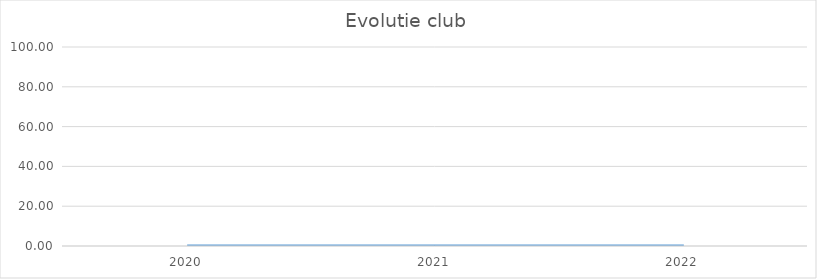
| Category | 0,00 |
|---|---|
| 2020.0 | 0 |
| 2021.0 | 0 |
| 2022.0 | 0 |